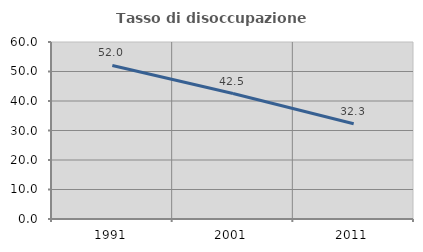
| Category | Tasso di disoccupazione giovanile  |
|---|---|
| 1991.0 | 52.043 |
| 2001.0 | 42.54 |
| 2011.0 | 32.288 |